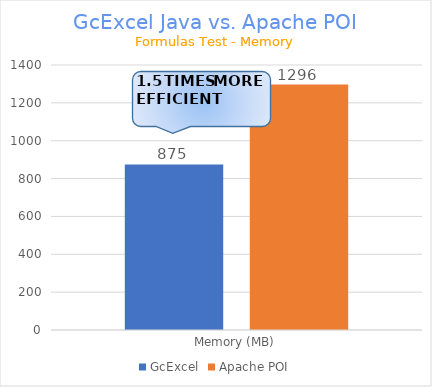
| Category | GcExcel | Apache POI |
|---|---|---|
| Memory (MB) | 874.598 | 1296.358 |